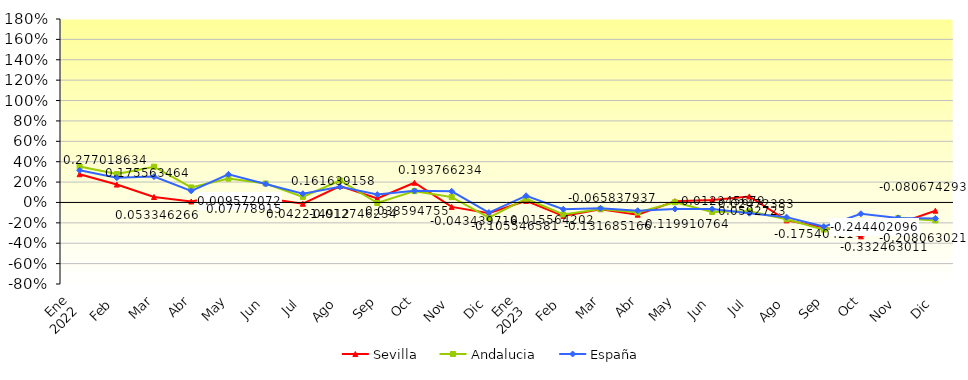
| Category | Sevilla  | Andalucia  | España |
|---|---|---|---|
| 0 | 0.277 | 0.353 | 0.316 |
| 1 | 0.176 | 0.278 | 0.242 |
| 2 | 0.053 | 0.351 | 0.254 |
| 3 | 0.01 | 0.147 | 0.114 |
| 4 | 0.078 | 0.234 | 0.275 |
| 5 | 0.042 | 0.186 | 0.182 |
| 6 | -0.013 | 0.055 | 0.086 |
| 7 | 0.162 | 0.216 | 0.153 |
| 8 | 0.039 | -0.005 | 0.077 |
| 9 | 0.194 | 0.111 | 0.114 |
| 10 | -0.043 | 0.053 | 0.11 |
| 11 | -0.106 | -0.149 | -0.099 |
| 12 | 0.016 | 0.037 | 0.066 |
| 13 | -0.132 | -0.118 | -0.066 |
| 14 | -0.066 | -0.063 | -0.057 |
| 15 | -0.12 | -0.099 | -0.081 |
| 16 | 0.012 | 0.002 | -0.064 |
| 17 | 0.025 | -0.093 | -0.064 |
| 18 | 0.059 | -0.087 | -0.105 |
| 19 | -0.175 | -0.165 | -0.144 |
| 20 | -0.244 | -0.266 | -0.237 |
| 21 | -0.332 | -0.18 | -0.111 |
| 22 | -0.208 | -0.154 | -0.151 |
| 23 | -0.081 | -0.176 | -0.156 |